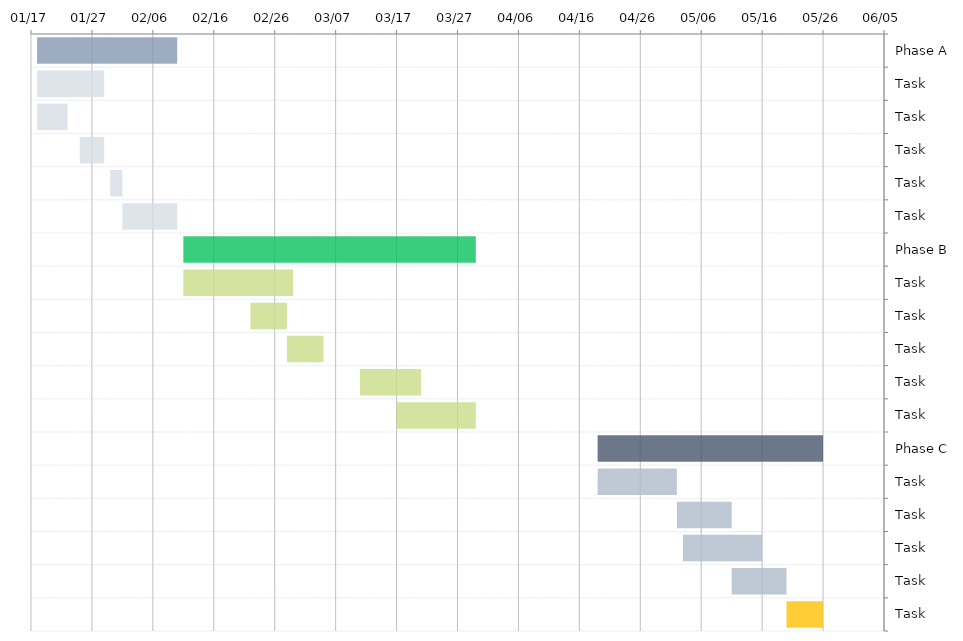
| Category | START DATE | DURATION 
in days |
|---|---|---|
| Phase A | 2024-01-18 | 23 |
| Task | 2024-01-18 | 11 |
| Task | 2024-01-18 | 5 |
| Task | 2024-01-25 | 4 |
| Task | 2024-01-30 | 2 |
| Task | 2024-02-01 | 9 |
| Phase B | 2024-02-11 | 48 |
| Task | 2024-02-11 | 18 |
| Task | 2024-02-22 | 6 |
| Task | 2024-02-28 | 6 |
| Task | 2024-03-11 | 10 |
| Task | 2024-03-17 | 13 |
| Phase C | 2024-04-19 | 37 |
| Task | 2024-04-19 | 13 |
| Task | 2024-05-02 | 9 |
| Task | 2024-05-03 | 13 |
| Task | 2024-05-11 | 9 |
| Task | 2024-05-20 | 6 |